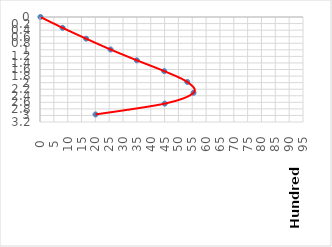
| Category | u |
|---|---|
| 16.652674645333057 | 0 |
| 815.9810576213198 | 0.33 |
| 1665.2674645333059 | 0.66 |
| 2547.859220735958 | 0.99 |
| 3497.061675519942 | 1.32 |
| 4487.895816917258 | 1.65 |
| 5320.5295491839115 | 1.98 |
| 5545.340656895908 | 2.31 |
| 4504.548491562592 | 2.64 |
| 2006.6472947626335 | 2.97 |